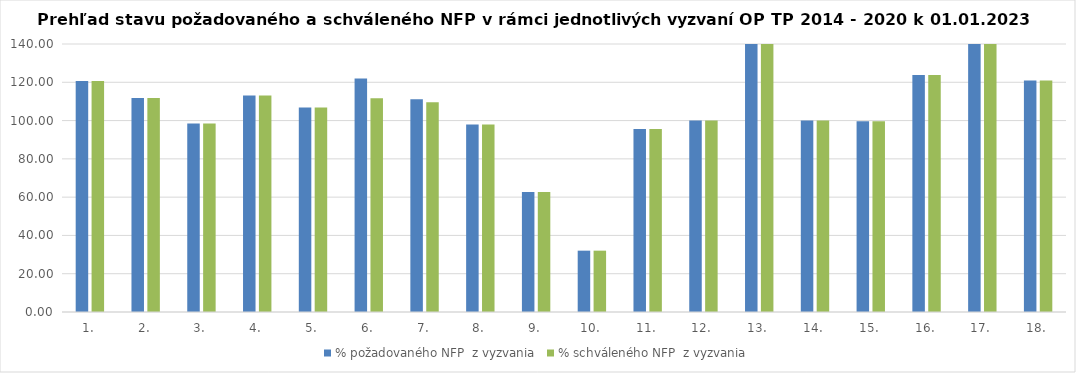
| Category | % požadovaného NFP  z vyzvania | % schváleného NFP  z vyzvania |
|---|---|---|
| 1. | 120.673 | 120.673 |
| 2. | 111.84 | 111.84 |
| 3. | 98.474 | 98.474 |
| 4. | 113.162 | 113.162 |
| 5. | 106.767 | 106.767 |
| 6. | 122.008 | 111.66 |
| 7. | 111.138 | 109.515 |
| 8. | 97.998 | 97.998 |
| 9. | 62.727 | 62.727 |
| 10. | 32.041 | 32.041 |
| 11. | 95.621 | 95.621 |
| 12. | 100.009 | 100.009 |
| 13. | 151.956 | 151.956 |
| 14. | 99.986 | 99.986 |
| 15. | 99.676 | 99.609 |
| 16. | 123.771 | 123.771 |
| 17. | 171.931 | 171.931 |
| 18. | 120.879 | 120.879 |